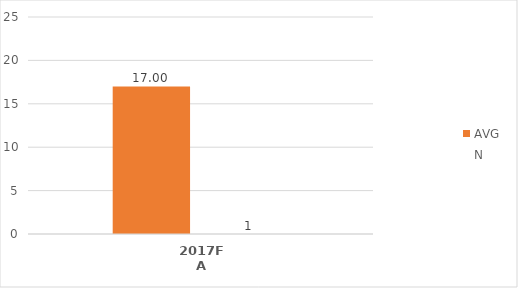
| Category | AVG | N |
|---|---|---|
| 2017FA | 17 | 1 |